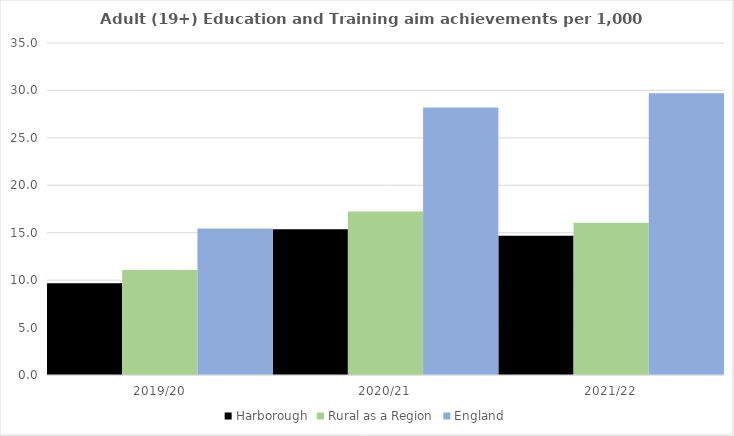
| Category | Harborough | Rural as a Region | England |
|---|---|---|---|
| 2019/20 | 9.685 | 11.081 | 15.446 |
| 2020/21 | 15.363 | 17.224 | 28.211 |
| 2021/22 | 14.681 | 16.063 | 29.711 |